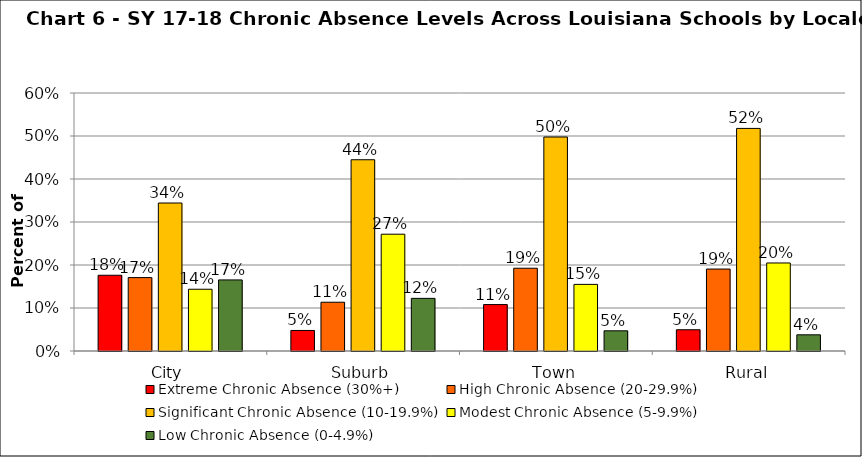
| Category | Extreme Chronic Absence (30%+) | High Chronic Absence (20-29.9%) | Significant Chronic Absence (10-19.9%) | Modest Chronic Absence (5-9.9%) | Low Chronic Absence (0-4.9%) |
|---|---|---|---|---|---|
| 0 | 0.176 | 0.171 | 0.344 | 0.144 | 0.165 |
| 1 | 0.048 | 0.113 | 0.445 | 0.272 | 0.122 |
| 2 | 0.108 | 0.192 | 0.498 | 0.155 | 0.047 |
| 3 | 0.049 | 0.191 | 0.518 | 0.205 | 0.038 |